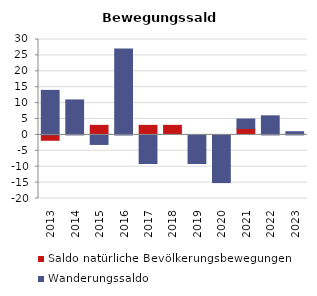
| Category | Saldo natürliche Bevölkerungsbewegungen | Wanderungssaldo |
|---|---|---|
| 2013.0 | -2 | 14 |
| 2014.0 | 0 | 11 |
| 2015.0 | 3 | -3 |
| 2016.0 | 0 | 27 |
| 2017.0 | 3 | -9 |
| 2018.0 | 3 | 0 |
| 2019.0 | 0 | -9 |
| 2020.0 | 0 | -15 |
| 2021.0 | 2 | 3 |
| 2022.0 | 0 | 6 |
| 2023.0 | 0 | 1 |